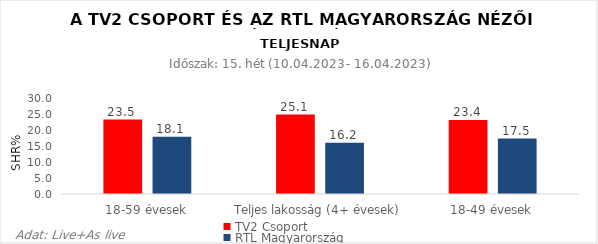
| Category | TV2 Csoport | RTL Magyarország |
|---|---|---|
| 18-59 évesek | 23.5 | 18.1 |
| Teljes lakosság (4+ évesek) | 25.1 | 16.2 |
| 18-49 évesek | 23.4 | 17.5 |